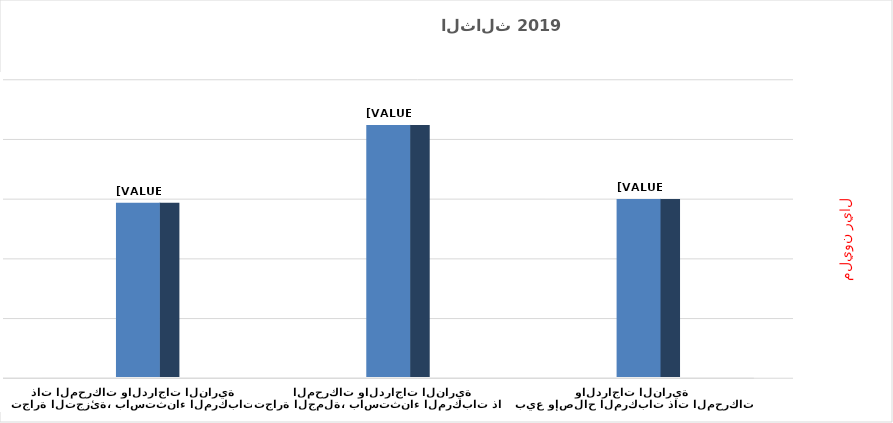
| Category | Series 0 |
|---|---|
| بيع وإصلاح المركبات ذات المحركات والدراجات النارية | 14916.982 |
| تجارة الجملة، باستثناء المركبات ذات المحركات والدراجات النارية | 21112.602 |
| تجارة التجزئة، باستثناء المركبات ذات المحركات والدراجات النارية | 14597.206 |